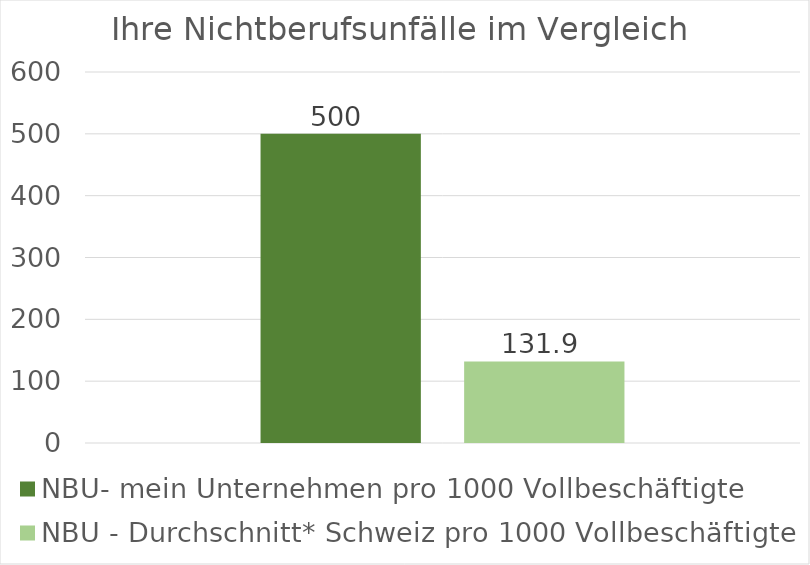
| Category | NBU- mein Unternehmen pro 1000 Vollbeschäftigte | NBU - Durchschnitt* Schweiz pro 1000 Vollbeschäftigte |
|---|---|---|
| 0 | 500 | 131.9 |